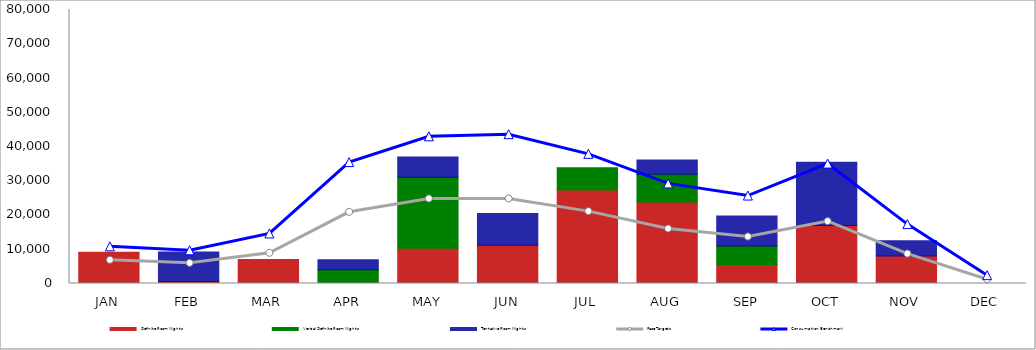
| Category | Definite Room Nights | Verbal Definite Room Nights | Tentative Room Nights |
|---|---|---|---|
| JAN | 9098 | 0 | 0 |
| FEB | 598 | 0 | 8593 |
| MAR | 7030 | 0 | 0 |
| APR | 0 | 4025 | 2902 |
| MAY | 10290 | 20727 | 5905 |
| JUN | 11200 | 0 | 9241 |
| JUL | 27289 | 6500 | 0 |
| AUG | 23774 | 8095 | 4204 |
| SEP | 5528 | 5430 | 8750 |
| OCT | 16919 | 0 | 18450 |
| NOV | 8012 | 0 | 4489 |
| DEC | 0 | 0 | 0 |